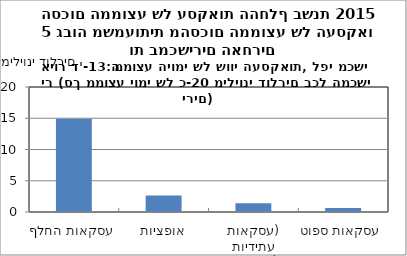
| Category | סכום |
|---|---|
| עסקאות החלף | 14936002.866 |
| אופציות | 2625364.626 |
| עסקאות עתידיות (פורוורד) | 1413741 |
| עסקאות ספוט | 641556 |